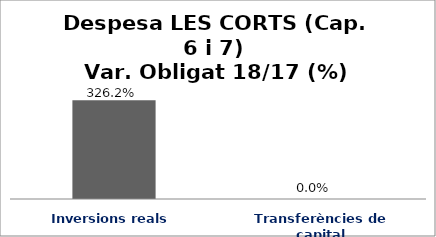
| Category | Series 0 |
|---|---|
| Inversions reals | 3.262 |
| Transferències de capital | 0 |